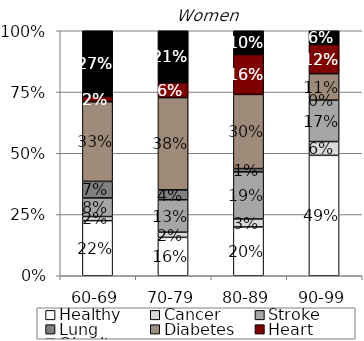
| Category | Healthy | Cancer | Stroke | Lung | Diabetes | Heart | Obesity |
|---|---|---|---|---|---|---|---|
| 60-69 | 0.225 | 0.017 | 0.076 | 0.068 | 0.325 | 0.022 | 0.268 |
| 70-79 | 0.157 | 0.021 | 0.133 | 0.04 | 0.377 | 0.061 | 0.212 |
| 80-89 | 0.199 | 0.032 | 0.192 | 0.014 | 0.303 | 0.163 | 0.097 |
| 90-99 | 0.491 | 0.056 | 0.169 | 0 | 0.108 | 0.119 | 0.056 |